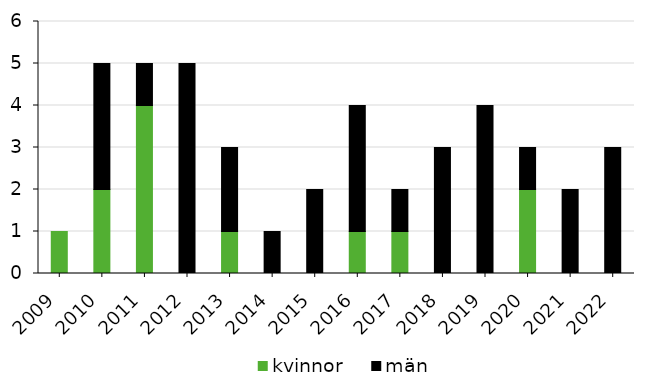
| Category | kvinnor | män |
|---|---|---|
| 2009 | 1 | 0 |
| 2010 | 2 | 3 |
| 2011 | 4 | 1 |
| 2012 | 0 | 5 |
| 2013 | 1 | 2 |
| 2014 | 0 | 1 |
| 2015 | 0 | 2 |
| 2016 | 1 | 3 |
| 2017 | 1 | 1 |
| 2018 | 0 | 3 |
| 2019 | 0 | 4 |
| 2020 | 2 | 1 |
| 2021 | 0 | 2 |
| 2022 | 0 | 3 |